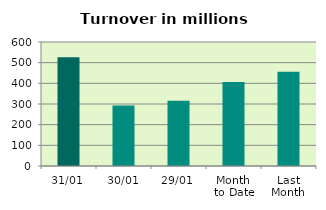
| Category | Series 0 |
|---|---|
| 31/01 | 526.632 |
| 30/01 | 292.155 |
| 29/01 | 315.194 |
| Month 
to Date | 406.6 |
| Last
Month | 455.699 |